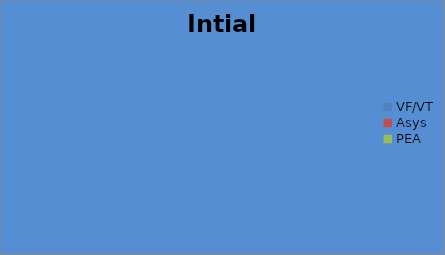
| Category | Intial Rhythm |
|---|---|
| VF/VT | 0 |
| Asys | 0 |
| PEA | 0 |